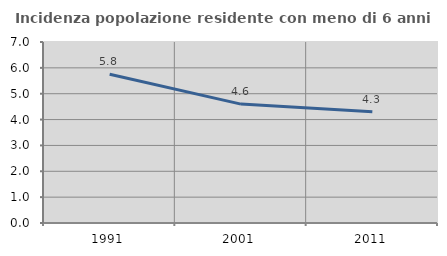
| Category | Incidenza popolazione residente con meno di 6 anni |
|---|---|
| 1991.0 | 5.75 |
| 2001.0 | 4.598 |
| 2011.0 | 4.299 |